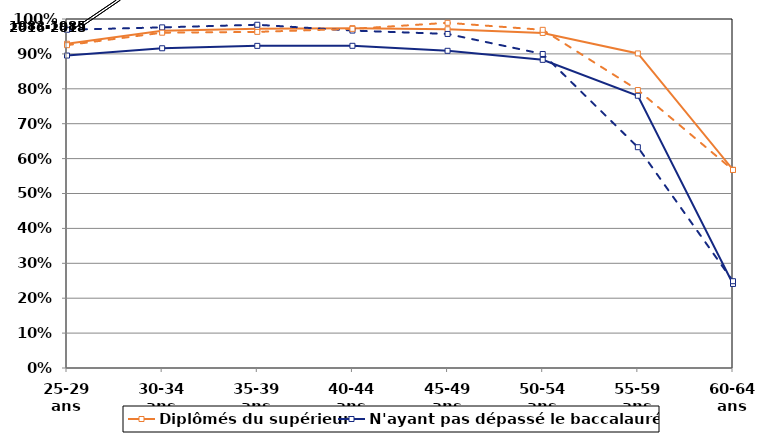
| Category | Diplômés du supérieur | N'ayant pas dépassé le baccalauréat* | Series 3 | Series 4 |
|---|---|---|---|---|
| 25-29 ans | 0.929 | 0.895 | 0.969 | 0.925 |
| 30-34 ans | 0.966 | 0.916 | 0.976 | 0.961 |
| 35-39 ans | 0.972 | 0.923 | 0.983 | 0.963 |
| 40-44 ans | 0.974 | 0.923 | 0.967 | 0.972 |
| 45-49 ans | 0.971 | 0.909 | 0.957 | 0.989 |
| 50-54 ans | 0.96 | 0.883 | 0.9 | 0.969 |
| 55-59 ans | 0.901 | 0.78 | 0.633 | 0.796 |
| 60-64 ans | 0.568 | 0.241 | 0.249 | 0.567 |